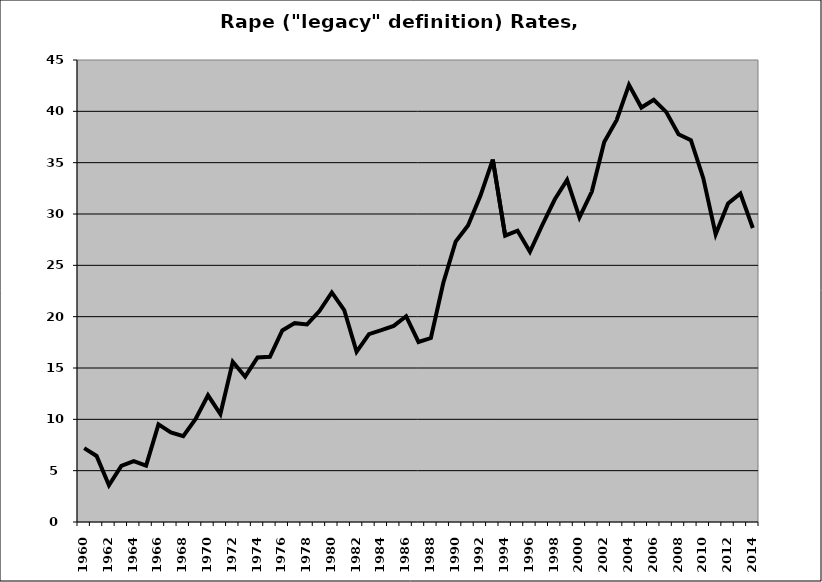
| Category | Rape |
|---|---|
| 1960.0 | 7.194 |
| 1961.0 | 6.433 |
| 1962.0 | 3.582 |
| 1963.0 | 5.47 |
| 1964.0 | 5.925 |
| 1965.0 | 5.491 |
| 1966.0 | 9.51 |
| 1967.0 | 8.727 |
| 1968.0 | 8.369 |
| 1969.0 | 10.028 |
| 1970.0 | 12.342 |
| 1971.0 | 10.519 |
| 1972.0 | 15.608 |
| 1973.0 | 14.156 |
| 1974.0 | 16.02 |
| 1975.0 | 16.098 |
| 1976.0 | 18.652 |
| 1977.0 | 19.37 |
| 1978.0 | 19.248 |
| 1979.0 | 20.552 |
| 1980.0 | 22.36 |
| 1981.0 | 20.647 |
| 1982.0 | 16.58 |
| 1983.0 | 18.301 |
| 1984.0 | 18.681 |
| 1985.0 | 19.104 |
| 1986.0 | 20.04 |
| 1987.0 | 17.535 |
| 1988.0 | 17.918 |
| 1989.0 | 23.274 |
| 1990.0 | 27.316 |
| 1991.0 | 28.874 |
| 1992.0 | 31.771 |
| 1993.0 | 35.305 |
| 1994.0 | 27.891 |
| 1995.0 | 28.375 |
| 1996.0 | 26.325 |
| 1997.0 | 28.926 |
| 1998.0 | 31.408 |
| 1999.0 | 33.315 |
| 2000.0 | 29.677 |
| 2001.0 | 32.183 |
| 2002.0 | 37.003 |
| 2003.0 | 39.136 |
| 2004.0 | 42.576 |
| 2005.0 | 40.368 |
| 2006.0 | 41.119 |
| 2007.0 | 39.949 |
| 2008.0 | 37.774 |
| 2009.0 | 37.198 |
| 2010.0 | 33.491 |
| 2011.0 | 28.035 |
| 2012.0 | 31.023 |
| 2013.0 | 31.993 |
| 2014.0 | 28.633 |